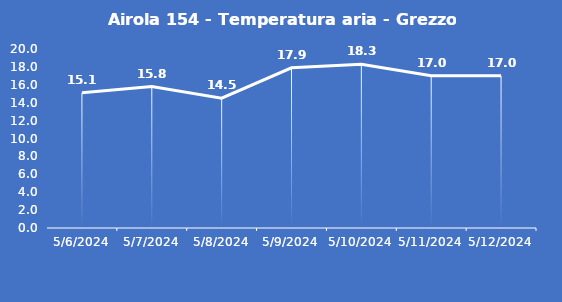
| Category | Airola 154 - Temperatura aria - Grezzo (°C) |
|---|---|
| 5/6/24 | 15.1 |
| 5/7/24 | 15.8 |
| 5/8/24 | 14.5 |
| 5/9/24 | 17.9 |
| 5/10/24 | 18.3 |
| 5/11/24 | 17 |
| 5/12/24 | 17 |